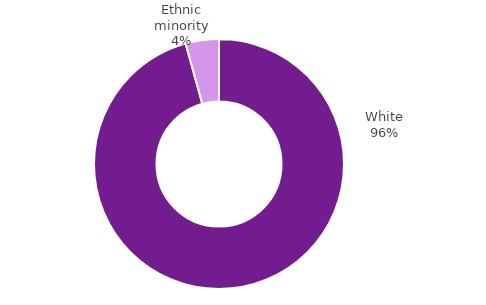
| Category | Series 0 |
|---|---|
| White | 0.957 |
| Ethnic minority | 0.043 |